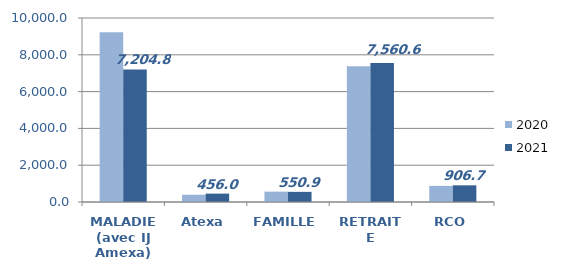
| Category | 2020 | 2021 |
|---|---|---|
| MALADIE (avec IJ Amexa) | 9222.871 | 7204.823 |
| Atexa | 394.965 | 456.044 |
| FAMILLE | 562.977 | 550.851 |
| RETRAITE | 7381.61 | 7560.648 |
| RCO | 875.896 | 906.745 |